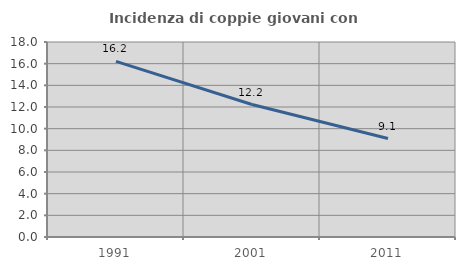
| Category | Incidenza di coppie giovani con figli |
|---|---|
| 1991.0 | 16.216 |
| 2001.0 | 12.228 |
| 2011.0 | 9.091 |